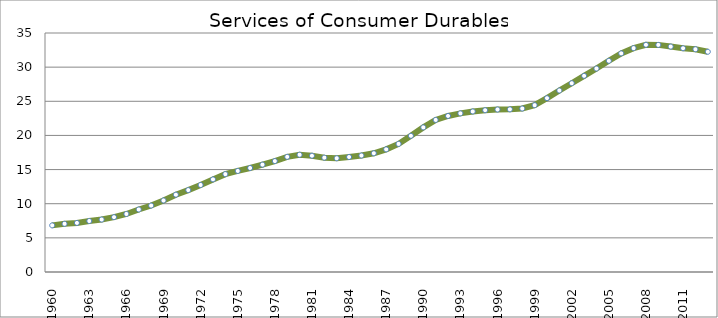
| Category | Series 0 |
|---|---|
| 1960.0 | 6.828 |
| 1961.0 | 7.057 |
| 1962.0 | 7.188 |
| 1963.0 | 7.466 |
| 1964.0 | 7.684 |
| 1965.0 | 8.029 |
| 1966.0 | 8.498 |
| 1967.0 | 9.153 |
| 1968.0 | 9.731 |
| 1969.0 | 10.475 |
| 1970.0 | 11.323 |
| 1971.0 | 11.994 |
| 1972.0 | 12.743 |
| 1973.0 | 13.561 |
| 1974.0 | 14.334 |
| 1975.0 | 14.798 |
| 1976.0 | 15.232 |
| 1977.0 | 15.721 |
| 1978.0 | 16.243 |
| 1979.0 | 16.866 |
| 1980.0 | 17.168 |
| 1981.0 | 17.03 |
| 1982.0 | 16.745 |
| 1983.0 | 16.657 |
| 1984.0 | 16.84 |
| 1985.0 | 17.057 |
| 1986.0 | 17.387 |
| 1987.0 | 17.959 |
| 1988.0 | 18.757 |
| 1989.0 | 19.946 |
| 1990.0 | 21.176 |
| 1991.0 | 22.269 |
| 1992.0 | 22.853 |
| 1993.0 | 23.231 |
| 1994.0 | 23.51 |
| 1995.0 | 23.692 |
| 1996.0 | 23.798 |
| 1997.0 | 23.818 |
| 1998.0 | 23.941 |
| 1999.0 | 24.433 |
| 2000.0 | 25.455 |
| 2001.0 | 26.577 |
| 2002.0 | 27.646 |
| 2003.0 | 28.727 |
| 2004.0 | 29.794 |
| 2005.0 | 30.927 |
| 2006.0 | 32.016 |
| 2007.0 | 32.784 |
| 2008.0 | 33.273 |
| 2009.0 | 33.258 |
| 2010.0 | 33.011 |
| 2011.0 | 32.765 |
| 2012.0 | 32.624 |
| 2013.0 | 32.252 |